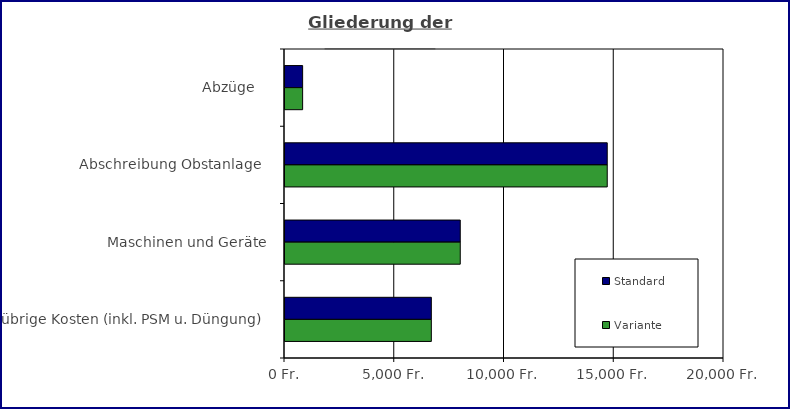
| Category | Standard | Variante  |
|---|---|---|
| Abzüge    | 803.631 | 803.631 |
| Abschreibung Obstanlage  | 14680.534 | 14680.56 |
| Maschinen und Geräte | 7984.426 | 7984.426 |
| übrige Kosten (inkl. PSM u. Düngung) | 6667.099 | 6667.099 |